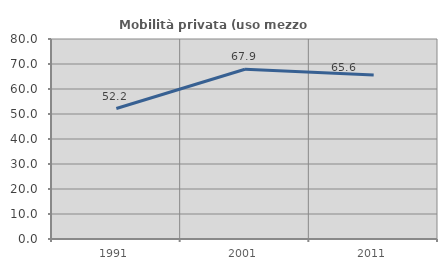
| Category | Mobilità privata (uso mezzo privato) |
|---|---|
| 1991.0 | 52.181 |
| 2001.0 | 67.881 |
| 2011.0 | 65.617 |